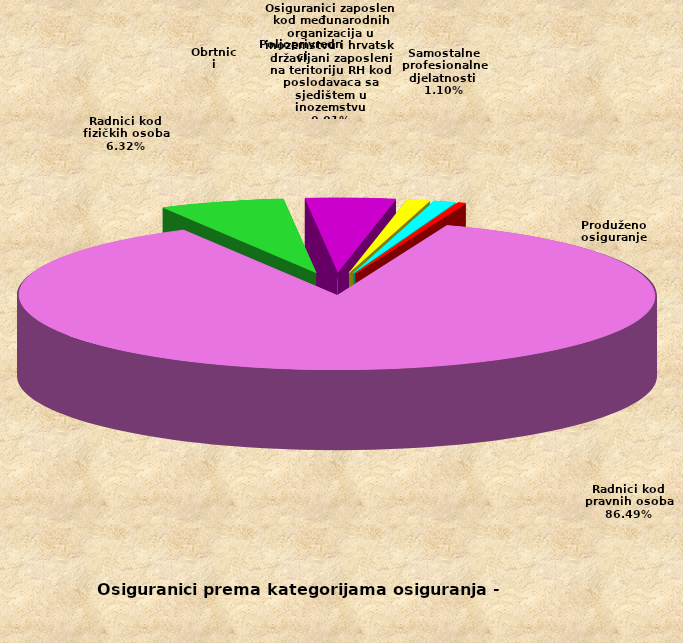
| Category | Series 0 |
|---|---|
| Radnici kod pravnih osoba | 1398586 |
| Radnici kod fizičkih osoba | 102182 |
| Obrtnici | 73434 |
| Poljoprivrednici | 18598 |
| Samostalne profesionalne djelatnosti  | 17832 |
| Osiguranici zaposleni kod međunarodnih organizacija u inozemstvu i hrvatski državljani zaposleni na teritoriju RH kod poslodavaca sa sjedištem u inozemstvu | 84 |
| Produženo osiguranje | 6290 |